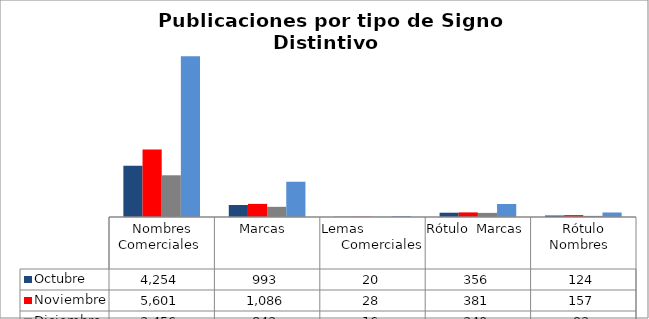
| Category | Octubre | Noviembre | Diciembre | Tolal  |
|---|---|---|---|---|
| Nombres Comerciales  | 4254 | 5601 | 3456 | 13311 |
| Marcas  | 993 | 1086 | 843 | 2922 |
| Lemas                    Comerciales | 20 | 28 | 16 | 64 |
| Rótulo  Marcas  | 356 | 381 | 340 | 1077 |
| Rótulo Nombres   | 124 | 157 | 93 | 374 |